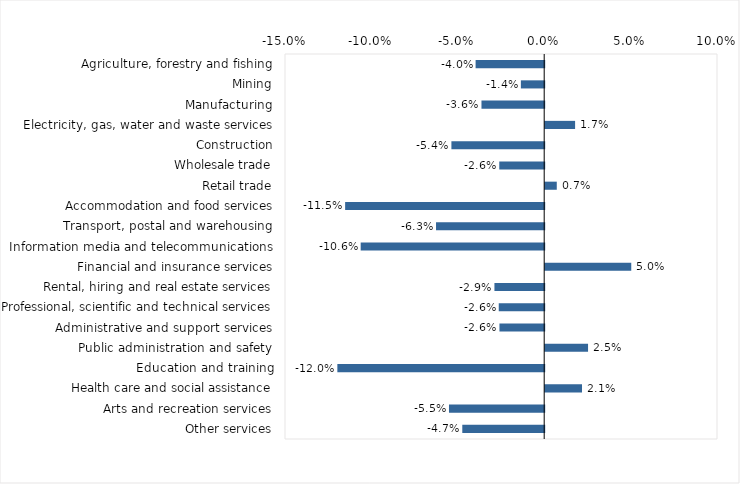
| Category | This week |
|---|---|
| Agriculture, forestry and fishing | -0.04 |
| Mining | -0.014 |
| Manufacturing | -0.036 |
| Electricity, gas, water and waste services | 0.017 |
| Construction | -0.054 |
| Wholesale trade | -0.026 |
| Retail trade | 0.007 |
| Accommodation and food services | -0.115 |
| Transport, postal and warehousing | -0.063 |
| Information media and telecommunications | -0.106 |
| Financial and insurance services | 0.05 |
| Rental, hiring and real estate services | -0.029 |
| Professional, scientific and technical services | -0.026 |
| Administrative and support services | -0.026 |
| Public administration and safety | 0.025 |
| Education and training | -0.12 |
| Health care and social assistance | 0.021 |
| Arts and recreation services | -0.055 |
| Other services | -0.047 |